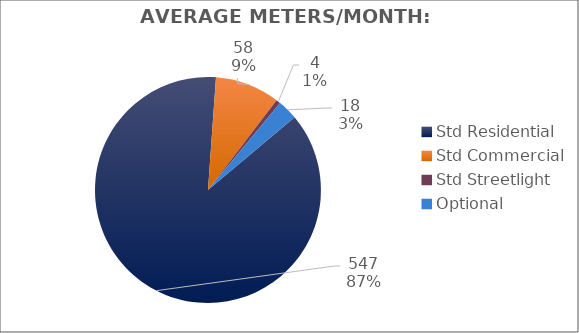
| Category | Meters |
|---|---|
| Std Residential | 547 |
| Std Commercial | 58 |
| Std Streetlight | 4 |
| Optional | 18 |